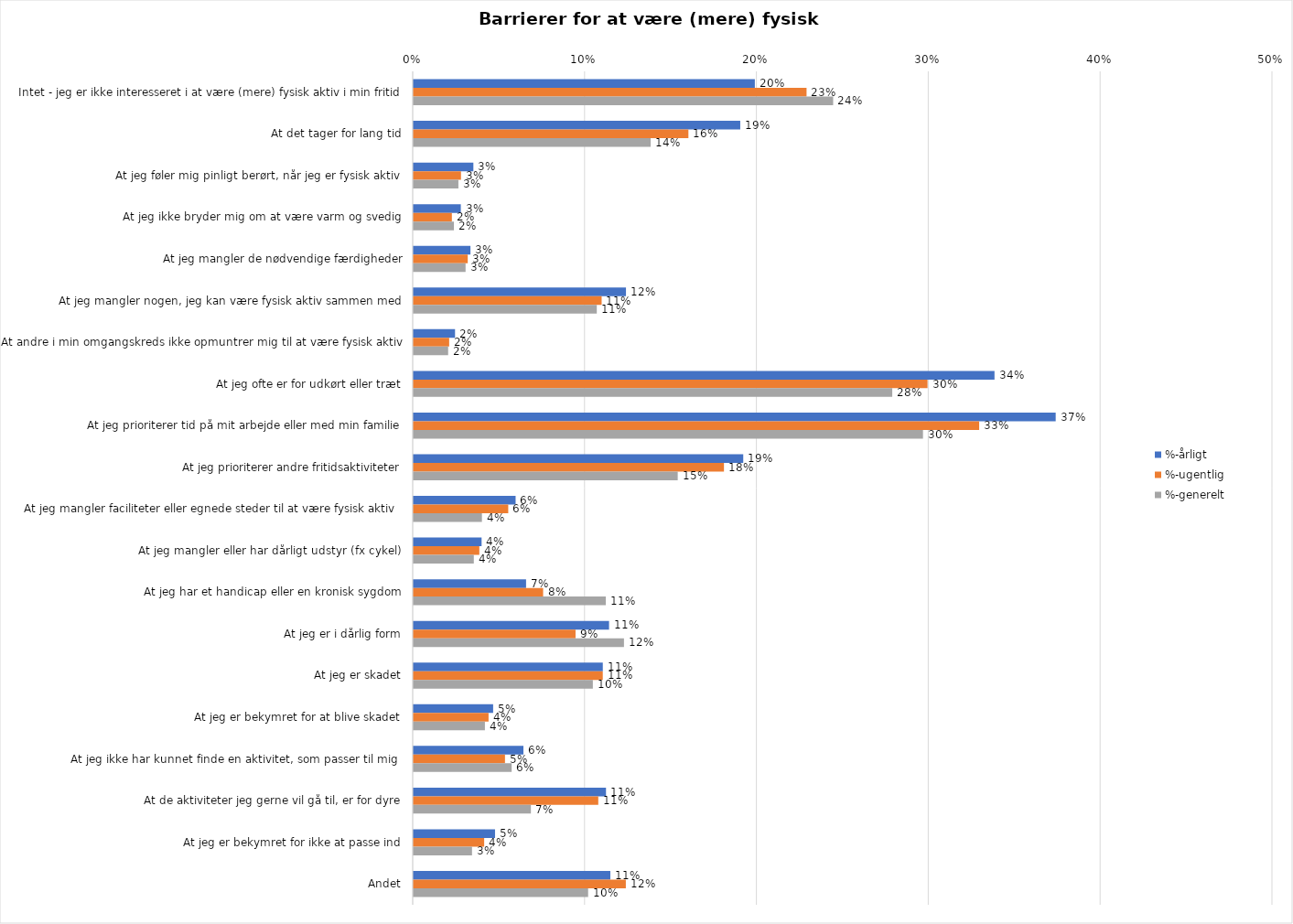
| Category | %-årligt | %-ugentlig | %-generelt |
|---|---|---|---|
| Intet - jeg er ikke interesseret i at være (mere) fysisk aktiv i min fritid | 0.199 | 0.229 | 0.244 |
| At det tager for lang tid | 0.19 | 0.16 | 0.138 |
| At jeg føler mig pinligt berørt, når jeg er fysisk aktiv | 0.035 | 0.028 | 0.026 |
| At jeg ikke bryder mig om at være varm og svedig | 0.027 | 0.022 | 0.023 |
| At jeg mangler de nødvendige færdigheder | 0.033 | 0.031 | 0.03 |
| At jeg mangler nogen, jeg kan være fysisk aktiv sammen med | 0.124 | 0.109 | 0.107 |
| At andre i min omgangskreds ikke opmuntrer mig til at være fysisk aktiv | 0.024 | 0.021 | 0.02 |
| At jeg ofte er for udkørt eller træt | 0.338 | 0.299 | 0.279 |
| At jeg prioriterer tid på mit arbejde eller med min familie | 0.374 | 0.329 | 0.296 |
| At jeg prioriterer andre fritidsaktiviteter | 0.192 | 0.181 | 0.154 |
| At jeg mangler faciliteter eller egnede steder til at være fysisk aktiv  | 0.059 | 0.055 | 0.04 |
| At jeg mangler eller har dårligt udstyr (fx cykel) | 0.04 | 0.038 | 0.035 |
| At jeg har et handicap eller en kronisk sygdom | 0.065 | 0.075 | 0.112 |
| At jeg er i dårlig form | 0.114 | 0.094 | 0.122 |
| At jeg er skadet | 0.11 | 0.11 | 0.104 |
| At jeg er bekymret for at blive skadet | 0.046 | 0.044 | 0.041 |
| At jeg ikke har kunnet finde en aktivitet, som passer til mig  | 0.064 | 0.053 | 0.057 |
| At de aktiviteter jeg gerne vil gå til, er for dyre | 0.112 | 0.107 | 0.068 |
| At jeg er bekymret for ikke at passe ind | 0.047 | 0.041 | 0.034 |
| Andet | 0.114 | 0.123 | 0.102 |